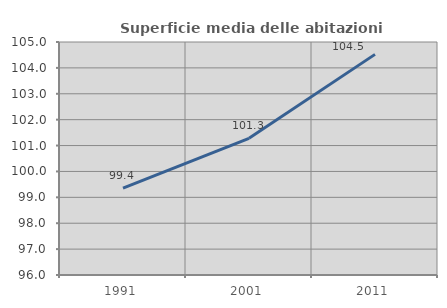
| Category | Superficie media delle abitazioni occupate |
|---|---|
| 1991.0 | 99.355 |
| 2001.0 | 101.277 |
| 2011.0 | 104.522 |